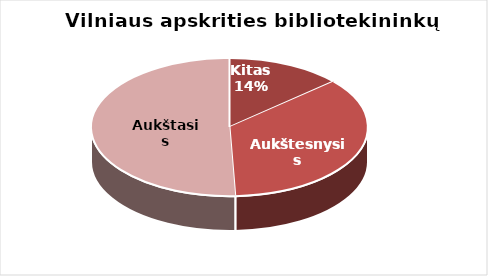
| Category | Series 0 |
|---|---|
| Kitas | 51 |
| Aukštesnysis | 135 |
| Aukštasis | 191 |